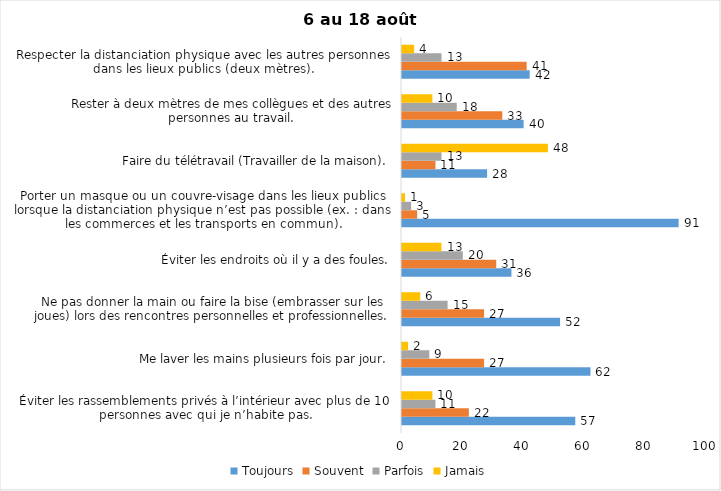
| Category | Toujours | Souvent | Parfois | Jamais |
|---|---|---|---|---|
| Éviter les rassemblements privés à l’intérieur avec plus de 10 personnes avec qui je n’habite pas. | 57 | 22 | 11 | 10 |
| Me laver les mains plusieurs fois par jour. | 62 | 27 | 9 | 2 |
| Ne pas donner la main ou faire la bise (embrasser sur les joues) lors des rencontres personnelles et professionnelles. | 52 | 27 | 15 | 6 |
| Éviter les endroits où il y a des foules. | 36 | 31 | 20 | 13 |
| Porter un masque ou un couvre-visage dans les lieux publics lorsque la distanciation physique n’est pas possible (ex. : dans les commerces et les transports en commun). | 91 | 5 | 3 | 1 |
| Faire du télétravail (Travailler de la maison). | 28 | 11 | 13 | 48 |
| Rester à deux mètres de mes collègues et des autres personnes au travail. | 40 | 33 | 18 | 10 |
| Respecter la distanciation physique avec les autres personnes dans les lieux publics (deux mètres). | 42 | 41 | 13 | 4 |